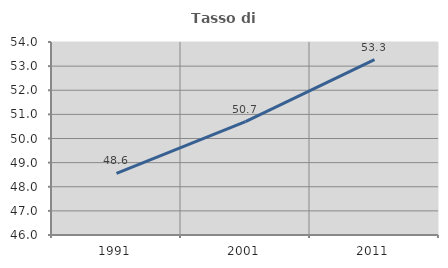
| Category | Tasso di occupazione   |
|---|---|
| 1991.0 | 48.551 |
| 2001.0 | 50.698 |
| 2011.0 | 53.274 |